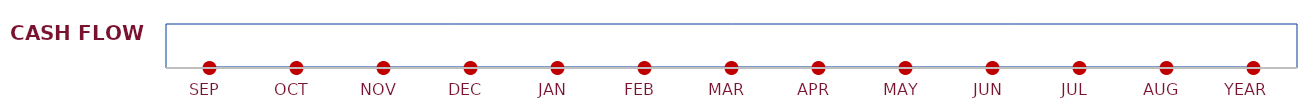
| Category | Cash Flow |
|---|---|
| SEP  | 0 |
| OCT  | 0 |
| NOV  | 0 |
| DEC  | 0 |
| JAN  | 0 |
| FEB  | 0 |
| MAR  | 0 |
| APR  | 0 |
| MAY  | 0 |
| JUN  | 0 |
| JUL  | 0 |
| AUG  | 0 |
| YEAR   | 0 |